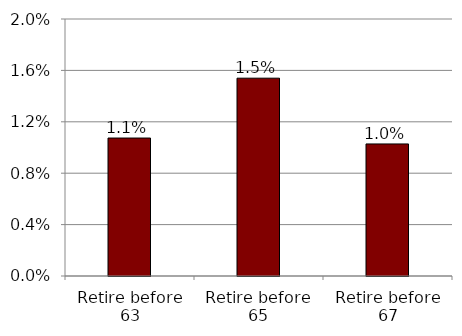
| Category | Series 0 |
|---|---|
| Retire before 63 | 0.011 |
| Retire before 65 | 0.015 |
| Retire before 67 | 0.01 |